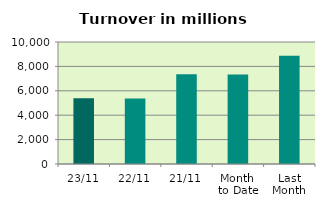
| Category | Series 0 |
|---|---|
| 23/11 | 5382.255 |
| 22/11 | 5370.064 |
| 21/11 | 7347.38 |
| Month 
to Date | 7342.955 |
| Last
Month | 8866.758 |